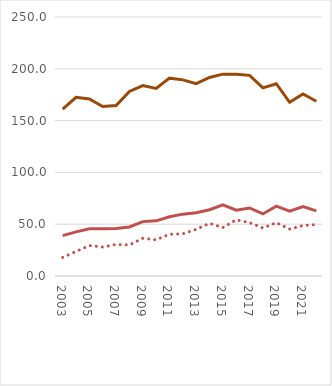
| Category | BCC | SCC invasiv | SCC insitu |
|---|---|---|---|
| 2003.0 | 161.122 | 38.956 | 17.925 |
| 2004.0 | 172.419 | 42.563 | 23.695 |
| 2005.0 | 170.832 | 45.497 | 29.373 |
| 2006.0 | 163.609 | 45.51 | 27.973 |
| 2007.0 | 164.482 | 45.841 | 30.425 |
| 2008.0 | 178.106 | 47.285 | 29.906 |
| 2009.0 | 183.859 | 52.502 | 36.397 |
| 2010.0 | 181.028 | 53.271 | 34.935 |
| 2011.0 | 190.96 | 57.235 | 40.273 |
| 2012.0 | 189.33 | 59.712 | 40.69 |
| 2013.0 | 185.73 | 61.12 | 45.03 |
| 2014.0 | 191.611 | 63.996 | 50.821 |
| 2015.0 | 194.833 | 68.616 | 46.745 |
| 2016.0 | 194.799 | 63.603 | 54.247 |
| 2017.0 | 193.654 | 65.684 | 51.546 |
| 2018.0 | 181.546 | 59.909 | 46.346 |
| 2019.0 | 185.591 | 67.385 | 51.487 |
| 2020.0 | 167.614 | 62.69 | 45.317 |
| 2021.0 | 175.634 | 67.027 | 48.681 |
| 2022.0 | 168.72 | 62.81 | 49.608 |